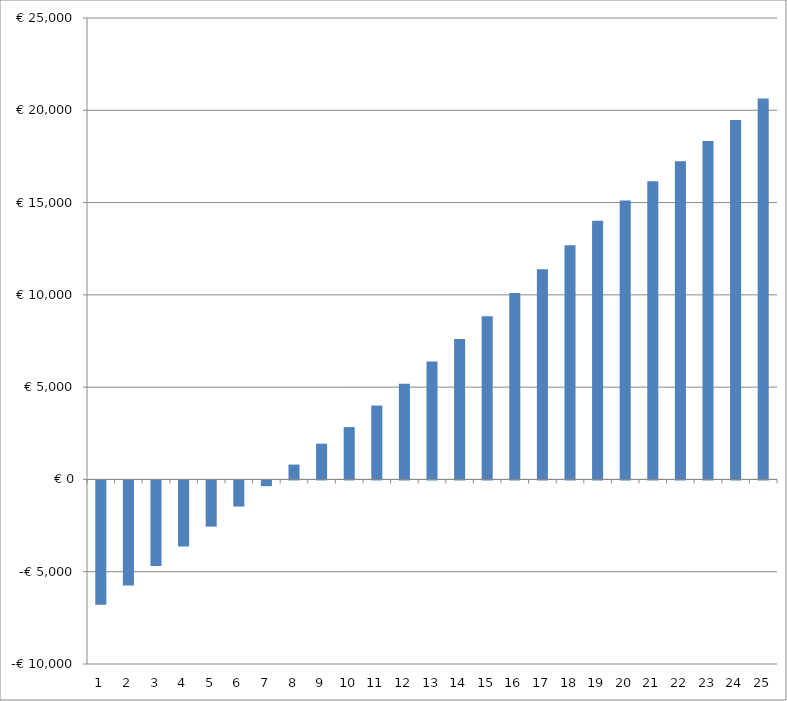
| Category | Series 0 |
|---|---|
| 0 | -6731.437 |
| 1 | -5692.707 |
| 2 | -4642.27 |
| 3 | -3579.573 |
| 4 | -2504.047 |
| 5 | -1415.106 |
| 6 | -312.149 |
| 7 | 805.442 |
| 8 | 1938.302 |
| 9 | 2837.083 |
| 10 | 4002.457 |
| 11 | 5185.115 |
| 12 | 6385.765 |
| 13 | 7605.138 |
| 14 | 8843.985 |
| 15 | 10103.076 |
| 16 | 11383.207 |
| 17 | 12685.194 |
| 18 | 14009.877 |
| 19 | 15108.121 |
| 20 | 16156.756 |
| 21 | 17233.673 |
| 22 | 18339.788 |
| 23 | 19476.043 |
| 24 | 20643.41 |